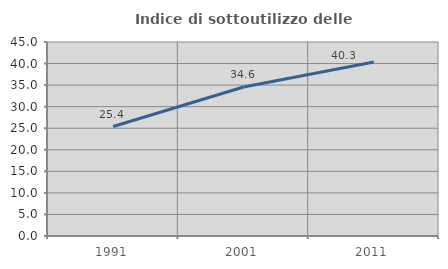
| Category | Indice di sottoutilizzo delle abitazioni  |
|---|---|
| 1991.0 | 25.389 |
| 2001.0 | 34.551 |
| 2011.0 | 40.345 |